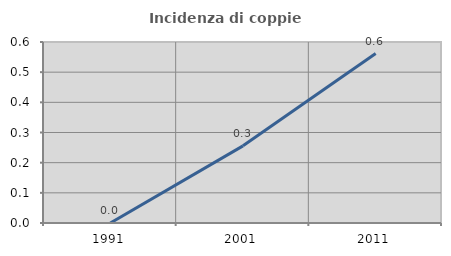
| Category | Incidenza di coppie miste |
|---|---|
| 1991.0 | 0 |
| 2001.0 | 0.256 |
| 2011.0 | 0.562 |